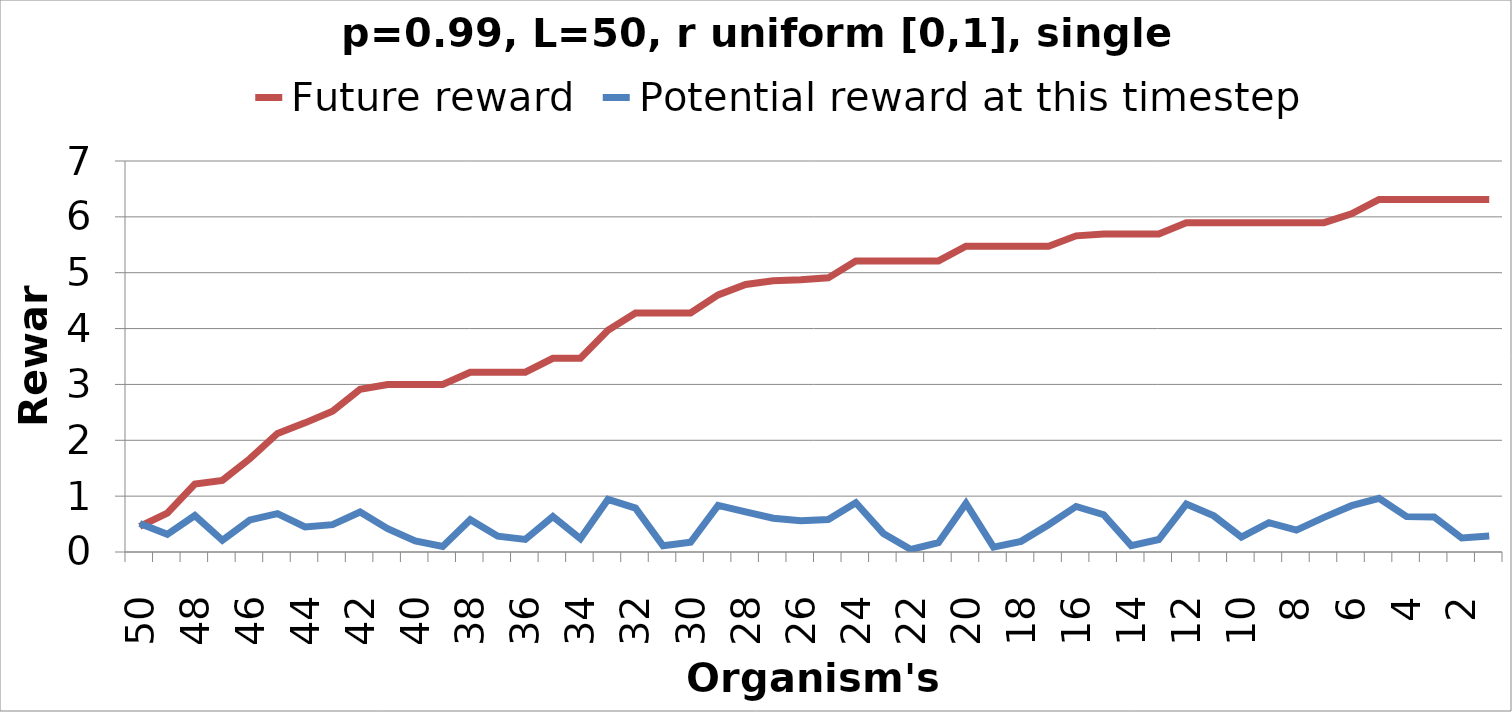
| Category | Future reward | Potential reward at this timestep |
|---|---|---|
| 50.0 | 0.458 | 0.509 |
| 49.0 | 0.697 | 0.316 |
| 48.0 | 1.215 | 0.653 |
| 47.0 | 1.283 | 0.21 |
| 46.0 | 1.671 | 0.574 |
| 45.0 | 2.121 | 0.686 |
| 44.0 | 2.312 | 0.447 |
| 43.0 | 2.522 | 0.49 |
| 42.0 | 2.914 | 0.716 |
| 41.0 | 2.998 | 0.417 |
| 40.0 | 2.998 | 0.198 |
| 39.0 | 2.998 | 0.098 |
| 38.0 | 3.218 | 0.578 |
| 37.0 | 3.218 | 0.284 |
| 36.0 | 3.218 | 0.225 |
| 35.0 | 3.468 | 0.635 |
| 34.0 | 3.468 | 0.237 |
| 33.0 | 3.969 | 0.942 |
| 32.0 | 4.28 | 0.786 |
| 31.0 | 4.28 | 0.112 |
| 30.0 | 4.28 | 0.174 |
| 29.0 | 4.604 | 0.836 |
| 28.0 | 4.79 | 0.719 |
| 27.0 | 4.856 | 0.605 |
| 26.0 | 4.873 | 0.558 |
| 25.0 | 4.908 | 0.58 |
| 24.0 | 5.211 | 0.882 |
| 23.0 | 5.211 | 0.333 |
| 22.0 | 5.211 | 0.045 |
| 21.0 | 5.211 | 0.167 |
| 20.0 | 5.473 | 0.87 |
| 19.0 | 5.473 | 0.089 |
| 18.0 | 5.473 | 0.191 |
| 17.0 | 5.473 | 0.489 |
| 16.0 | 5.66 | 0.815 |
| 15.0 | 5.695 | 0.668 |
| 14.0 | 5.695 | 0.114 |
| 13.0 | 5.695 | 0.223 |
| 12.0 | 5.896 | 0.857 |
| 11.0 | 5.896 | 0.647 |
| 10.0 | 5.896 | 0.267 |
| 9.0 | 5.896 | 0.524 |
| 8.0 | 5.896 | 0.392 |
| 7.0 | 5.896 | 0.62 |
| 6.0 | 6.053 | 0.829 |
| 5.0 | 6.312 | 0.96 |
| 4.0 | 6.312 | 0.633 |
| 3.0 | 6.312 | 0.626 |
| 2.0 | 6.312 | 0.25 |
| 1.0 | 6.312 | 0.285 |